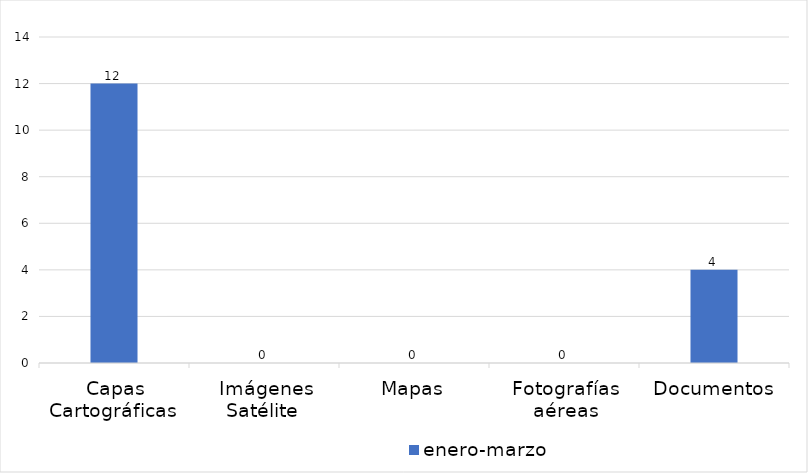
| Category | enero-marzo |
|---|---|
| Capas Cartográficas  | 12 |
| Imágenes Satélite  | 0 |
| Mapas | 0 |
| Fotografías aéreas | 0 |
| Documentos | 4 |